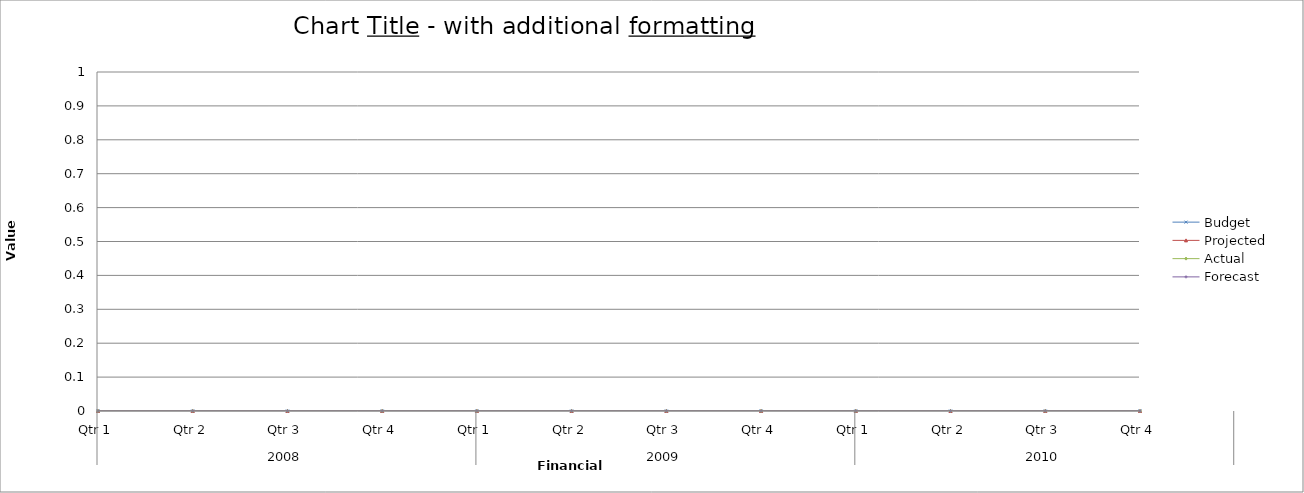
| Category | Budget | Projected | Actual | Forecast |
|---|---|---|---|---|
| 0 | 1880 | 2400 | 1140 | 2780 |
| 1 | 1760 | 1860 | 820 | 1740 |
| 2 | 2770 | 1830 | 890 | 1700 |
| 3 | 520 | 2760 | 2310 | 3070 |
| 4 | 2900 | 2930 | 2300 | 2700 |
| 5 | 2260 | 3450 | 2000 | 2230 |
| 6 | 3360 | 1820 | 3440 | 2790 |
| 7 | 1120 | 2520 | 1440 | 2610 |
| 8 | 3210 | 3320 | 1350 | 1880 |
| 9 | 1430 | 3410 | 2460 | 1380 |
| 10 | 1350 | 1760 | 2680 | 1930 |
| 11 | 1410 | 1240 | 1250 | 2640 |